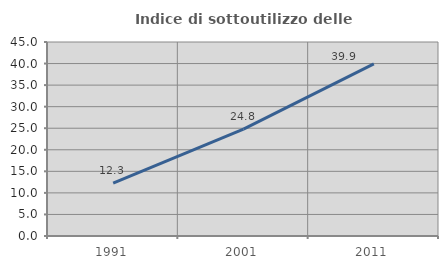
| Category | Indice di sottoutilizzo delle abitazioni  |
|---|---|
| 1991.0 | 12.279 |
| 2001.0 | 24.797 |
| 2011.0 | 39.946 |